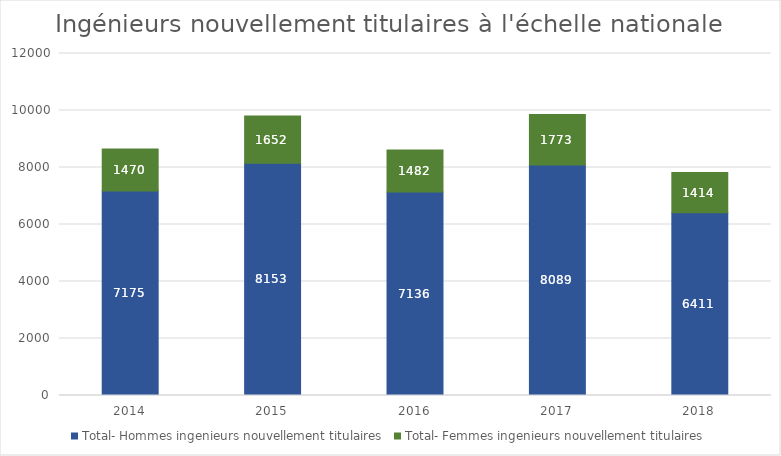
| Category | Total- Hommes ingenieurs nouvellement titulaires | Total- Femmes ingenieurs nouvellement titulaires |
|---|---|---|
| 2014.0 | 7175 | 1470 |
| 2015.0 | 8153 | 1652 |
| 2016.0 | 7136 | 1482 |
| 2017.0 | 8089 | 1773 |
| 2018.0 | 6411 | 1414 |